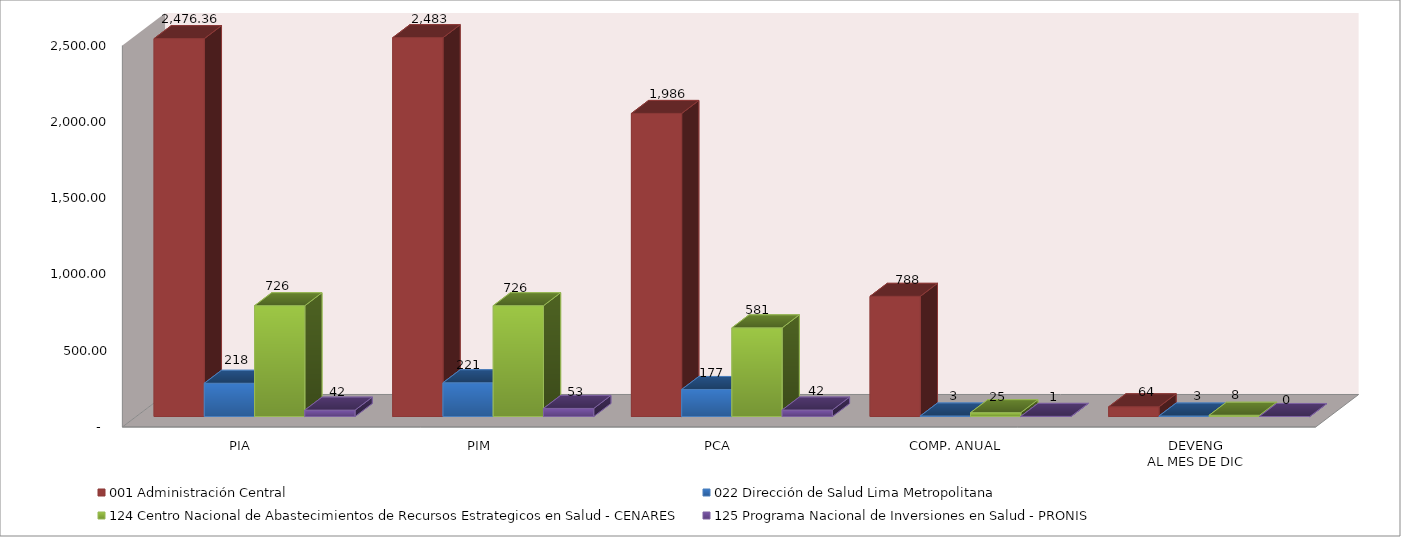
| Category | 001 Administración Central | 022 Dirección de Salud Lima Metropolitana | 124 Centro Nacional de Abastecimientos de Recursos Estrategicos en Salud - CENARES | 125 Programa Nacional de Inversiones en Salud - PRONIS |
|---|---|---|---|---|
| PIA | 2476.363 | 217.84 | 726.35 | 41.838 |
| PIM | 2482.679 | 221.288 | 726.421 | 53.036 |
| PCA | 1986.143 | 177.031 | 581.136 | 42.429 |
| COMP. ANUAL | 787.63 | 3.439 | 25.244 | 0.839 |
| DEVENG
AL MES DE DIC | 63.65 | 3.219 | 8.301 | 0.026 |